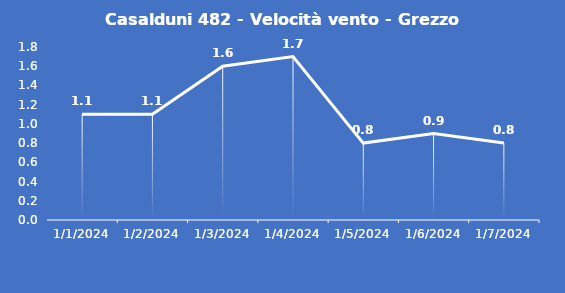
| Category | Casalduni 482 - Velocità vento - Grezzo (m/s) |
|---|---|
| 1/1/24 | 1.1 |
| 1/2/24 | 1.1 |
| 1/3/24 | 1.6 |
| 1/4/24 | 1.7 |
| 1/5/24 | 0.8 |
| 1/6/24 | 0.9 |
| 1/7/24 | 0.8 |